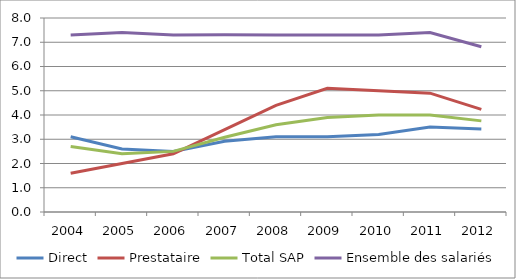
| Category | Direct | Prestataire | Total SAP | Ensemble des salariés |
|---|---|---|---|---|
| 2004.0 | 3.1 | 1.6 | 2.7 | 7.3 |
| 2005.0 | 2.6 | 2 | 2.4 | 7.4 |
| 2006.0 | 2.5 | 2.4 | 2.5 | 7.3 |
| 2007.0 | 2.914 | 3.393 | 3.082 | 7.31 |
| 2008.0 | 3.1 | 4.4 | 3.6 | 7.3 |
| 2009.0 | 3.1 | 5.1 | 3.9 | 7.3 |
| 2010.0 | 3.2 | 5 | 4 | 7.3 |
| 2011.0 | 3.5 | 4.9 | 4 | 7.4 |
| 2012.0 | 3.418 | 4.232 | 3.758 | 6.813 |